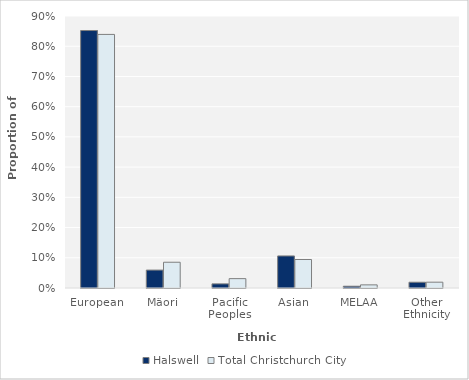
| Category | Halswell | Total Christchurch City |
|---|---|---|
| European | 0.852 | 0.839 |
| Mäori | 0.059 | 0.085 |
| Pacific Peoples | 0.014 | 0.031 |
| Asian | 0.106 | 0.094 |
| MELAA | 0.006 | 0.01 |
| Other Ethnicity | 0.019 | 0.019 |